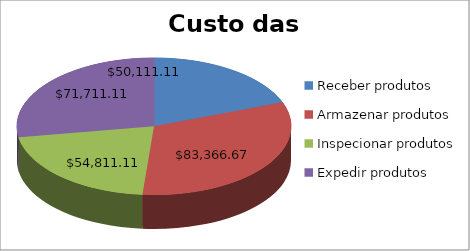
| Category | Custo das Atividades |
|---|---|
| Receber produtos | 50111.111 |
| Armazenar produtos  | 83366.667 |
| Inspecionar produtos | 54811.111 |
| Expedir produtos | 71711.111 |